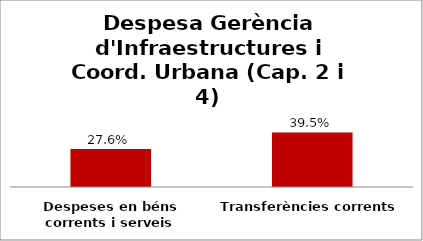
| Category | Series 0 |
|---|---|
| Despeses en béns corrents i serveis | 0.276 |
| Transferències corrents | 0.395 |